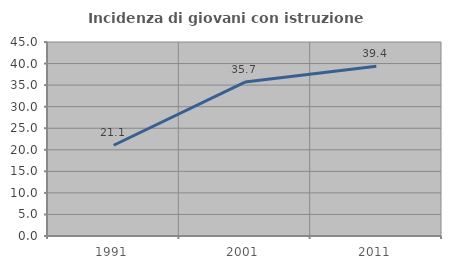
| Category | Incidenza di giovani con istruzione universitaria |
|---|---|
| 1991.0 | 21.053 |
| 2001.0 | 35.714 |
| 2011.0 | 39.394 |